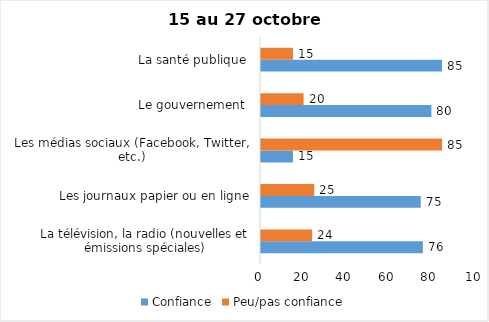
| Category | Confiance | Peu/pas confiance |
|---|---|---|
| La télévision, la radio (nouvelles et émissions spéciales) | 76 | 24 |
| Les journaux papier ou en ligne | 75 | 25 |
| Les médias sociaux (Facebook, Twitter, etc.) | 15 | 85 |
| Le gouvernement  | 80 | 20 |
| La santé publique  | 85 | 15 |